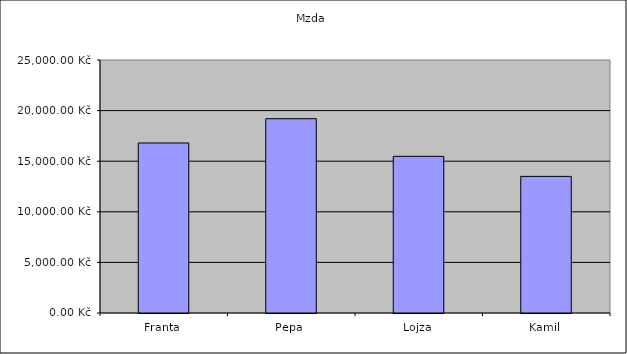
| Category | Mzda |
|---|---|
| Franta | 16800 |
| Pepa | 19200 |
| Lojza | 15480 |
| Kamil | 13500 |